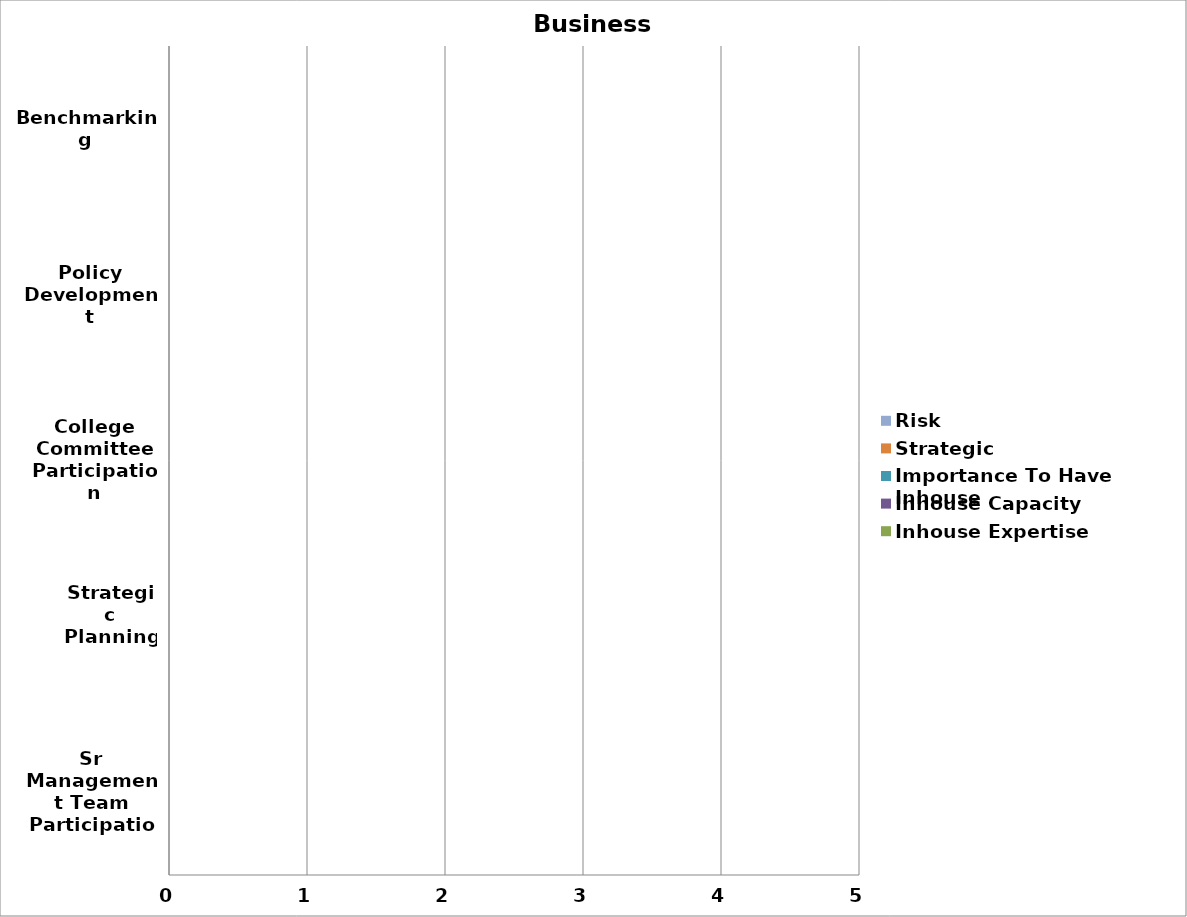
| Category | Inhouse Expertise | Inhouse Capacity | Importance To Have Inhouse | Strategic | Risk |
|---|---|---|---|---|---|
| Sr Management Team Participation | 0 | 0 | 0 | 0 | 0 |
| Strategic Planning | 0 | 0 | 0 | 0 | 0 |
| College Committee Participation | 0 | 0 | 0 | 0 | 0 |
| Policy Development | 0 | 0 | 0 | 0 | 0 |
| Benchmarking | 0 | 0 | 0 | 0 | 0 |